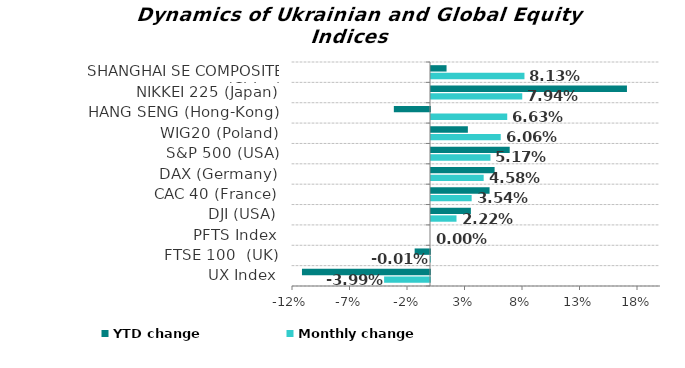
| Category | Monthly change | YTD change |
|---|---|---|
| UX Index | -0.04 | -0.111 |
| FTSE 100  (UK) | 0 | -0.013 |
| PFTS Index | 0 | 0 |
| DJI (USA) | 0.022 | 0.035 |
| CAC 40 (France) | 0.035 | 0.051 |
| DAX (Germany) | 0.046 | 0.055 |
| S&P 500 (USA) | 0.052 | 0.068 |
| WIG20 (Poland) | 0.061 | 0.032 |
| HANG SENG (Hong-Kong) | 0.066 | -0.031 |
| NIKKEI 225 (Japan) | 0.079 | 0.17 |
| SHANGHAI SE COMPOSITE (China) | 0.081 | 0.014 |